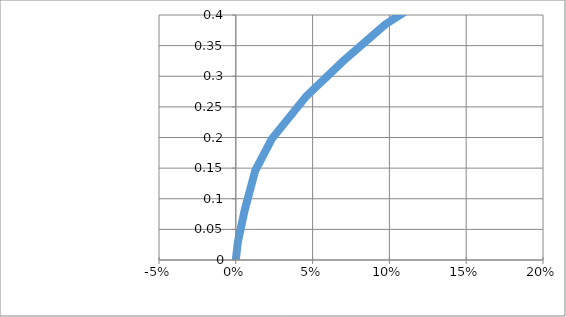
| Category | % light output |
|---|---|
| 0.9266517297187626 | 1 |
| 0.9246219898342282 | 0.978 |
| 0.8834054034303208 | 0.953 |
| 0.7723493900838806 | 0.923 |
| 0.7013223914620592 | 0.894 |
| 0.5978476616611617 | 0.855 |
| 0.5039076500623506 | 0.811 |
| 0.4267799027228058 | 0.759 |
| 0.3481373716877623 | 0.701 |
| 0.28263477267756504 | 0.65 |
| 0.22340078347668063 | 0.579 |
| 0.17852029693039578 | 0.515 |
| 0.13737664552015963 | 0.45 |
| 0.09734396127400374 | 0.385 |
| 0.07010799818283212 | 0.325 |
| 0.04580181947369796 | 0.267 |
| 0.02335635819297977 | 0.197 |
| 0.012675231689946354 | 0.146 |
| 0.0057014422332208395 | 0.081 |
| 0.0013036742793905514 | 0.029 |
| 0.0 | 0 |